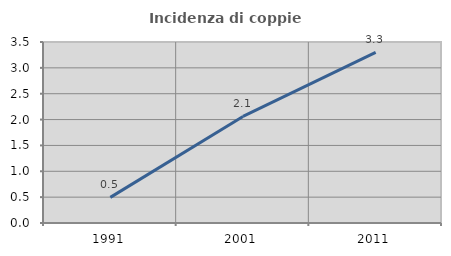
| Category | Incidenza di coppie miste |
|---|---|
| 1991.0 | 0.495 |
| 2001.0 | 2.061 |
| 2011.0 | 3.298 |